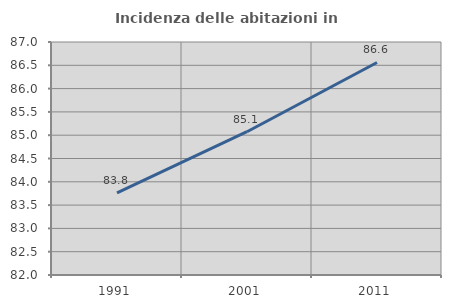
| Category | Incidenza delle abitazioni in proprietà  |
|---|---|
| 1991.0 | 83.763 |
| 2001.0 | 85.075 |
| 2011.0 | 86.561 |